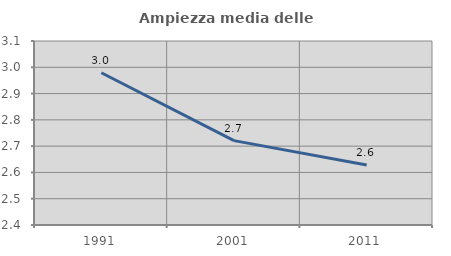
| Category | Ampiezza media delle famiglie |
|---|---|
| 1991.0 | 2.979 |
| 2001.0 | 2.721 |
| 2011.0 | 2.629 |